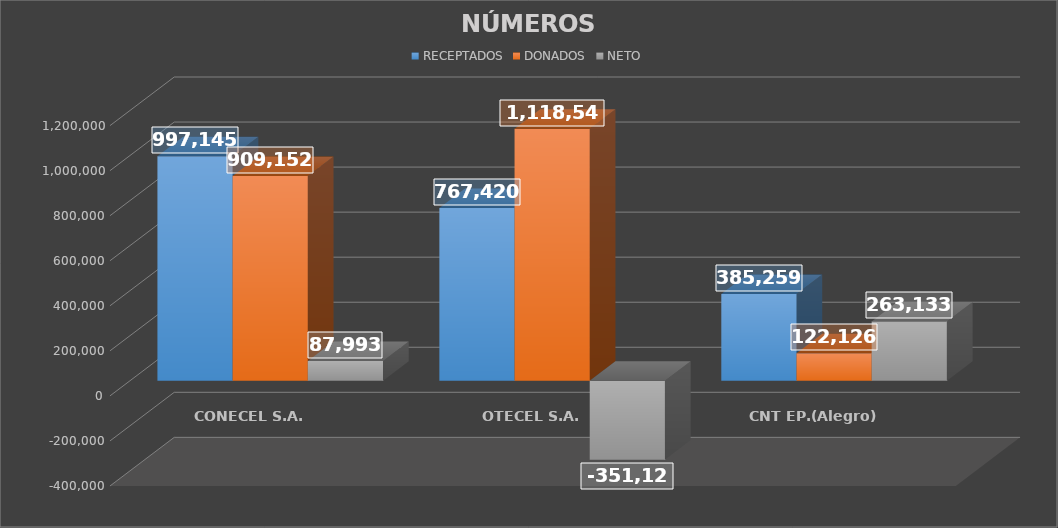
| Category | RECEPTADOS | DONADOS | NETO |
|---|---|---|---|
| CONECEL S.A. | 997145 | 909152 | 87993 |
| OTECEL S.A. | 767420 | 1118546 | -351126 |
| CNT EP.(Alegro) | 385259 | 122126 | 263133 |